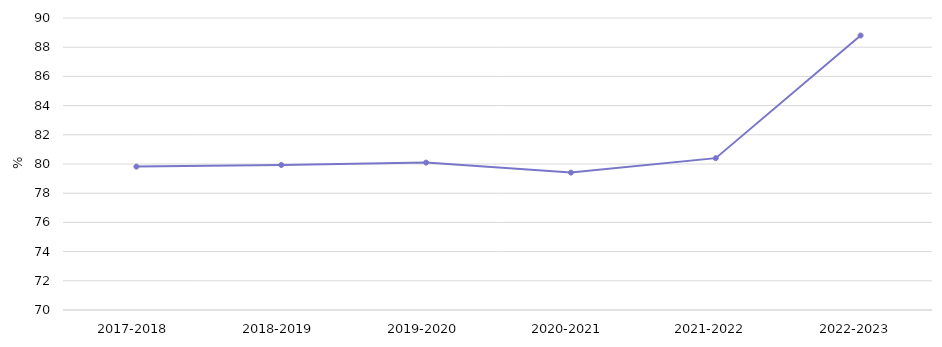
| Category | Series 0 |
|---|---|
| 2017-2018 | 79.82 |
| 2018-2019 | 79.933 |
| 2019-2020 | 80.097 |
| 2020-2021 | 79.41 |
| 2021-2022  | 80.4 |
| 2022-2023  | 88.8 |